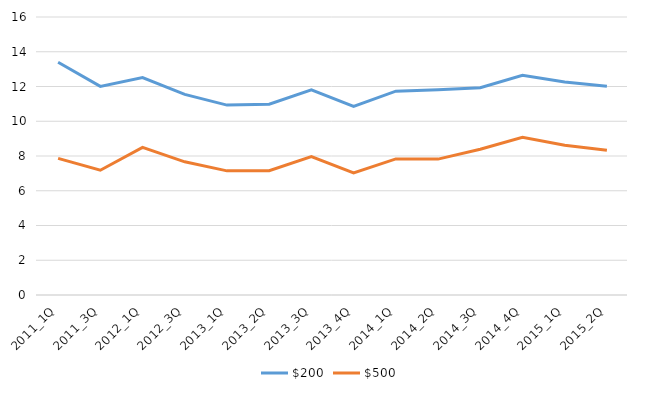
| Category | $200 | $500 |
|---|---|---|
| 2011_1Q | 13.394 | 7.866 |
| 2011_3Q | 12.009 | 7.183 |
| 2012_1Q | 12.511 | 8.499 |
| 2012_3Q | 11.547 | 7.665 |
| 2013_1Q | 10.93 | 7.145 |
| 2013_2Q | 10.981 | 7.149 |
| 2013_3Q | 11.807 | 7.966 |
| 2013_4Q | 10.854 | 7.024 |
| 2014_1Q | 11.732 | 7.831 |
| 2014_2Q | 11.812 | 7.821 |
| 2014_3Q | 11.932 | 8.391 |
| 2014_4Q | 12.646 | 9.075 |
| 2015_1Q | 12.254 | 8.613 |
| 2015_2Q | 12.021 | 8.335 |